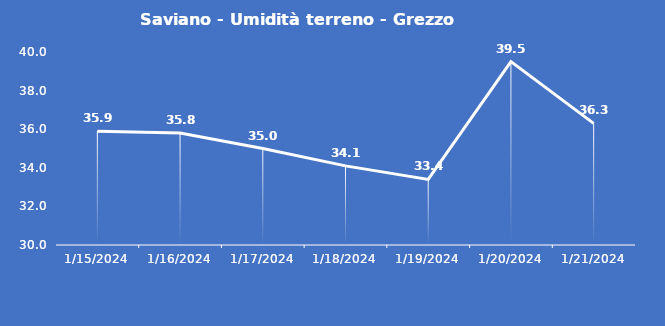
| Category | Saviano - Umidità terreno - Grezzo (%VWC) |
|---|---|
| 1/15/24 | 35.9 |
| 1/16/24 | 35.8 |
| 1/17/24 | 35 |
| 1/18/24 | 34.1 |
| 1/19/24 | 33.4 |
| 1/20/24 | 39.5 |
| 1/21/24 | 36.3 |